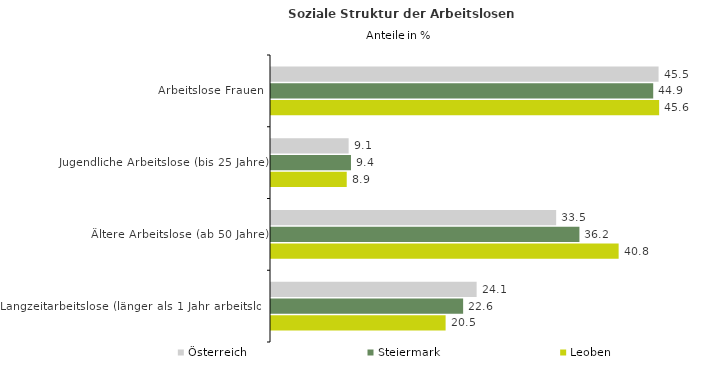
| Category | Österreich | Steiermark | Leoben |
|---|---|---|---|
| Arbeitslose Frauen | 45.49 | 44.861 | 45.556 |
| Jugendliche Arbeitslose (bis 25 Jahre) | 9.111 | 9.387 | 8.889 |
| Ältere Arbeitslose (ab 50 Jahre) | 33.469 | 36.201 | 40.802 |
| Langzeitarbeitslose (länger als 1 Jahr arbeitslos) | 24.136 | 22.55 | 20.494 |